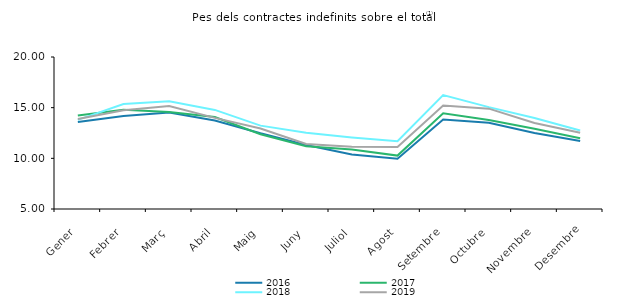
| Category | 2016 | 2017 | 2018 | 2019 |
|---|---|---|---|---|
| Gener | 13.583 | 14.221 | 13.796 | 13.89 |
| Febrer | 14.183 | 14.802 | 15.358 | 14.735 |
| Març | 14.534 | 14.578 | 15.624 | 15.171 |
| Abril | 13.742 | 14.074 | 14.777 | 13.99 |
| Maig | 12.469 | 12.379 | 13.227 | 12.941 |
| Juny | 11.317 | 11.193 | 12.535 | 11.412 |
| Juliol | 10.375 | 10.867 | 12.061 | 11.14 |
| Agost | 9.962 | 10.27 | 11.684 | 11.114 |
| Setembre | 13.823 | 14.448 | 16.239 | 15.206 |
| Octubre | 13.518 | 13.778 | 15.056 | 14.904 |
| Novembre | 12.499 | 12.926 | 13.979 | 13.489 |
| Desembre | 11.702 | 11.985 | 12.745 | 12.517 |